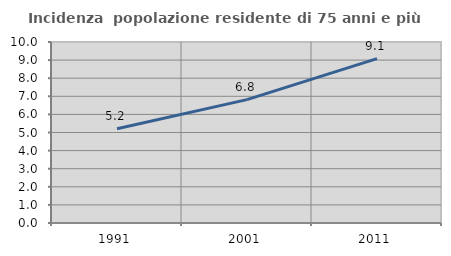
| Category | Incidenza  popolazione residente di 75 anni e più |
|---|---|
| 1991.0 | 5.203 |
| 2001.0 | 6.817 |
| 2011.0 | 9.078 |